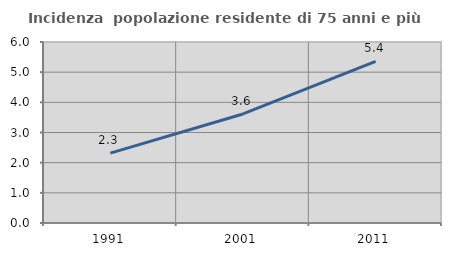
| Category | Incidenza  popolazione residente di 75 anni e più |
|---|---|
| 1991.0 | 2.315 |
| 2001.0 | 3.614 |
| 2011.0 | 5.357 |